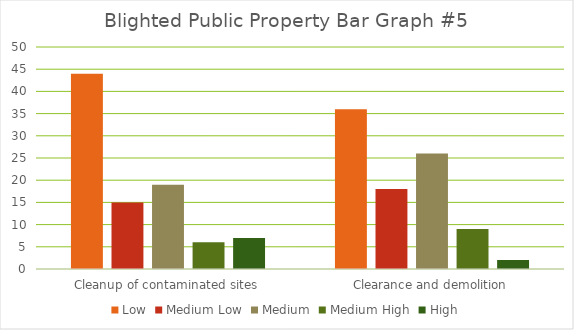
| Category | Low | Medium Low | Medium | Medium High | High |
|---|---|---|---|---|---|
| Cleanup of contaminated sites | 44 | 15 | 19 | 6 | 7 |
| Clearance and demolition | 36 | 18 | 26 | 9 | 2 |